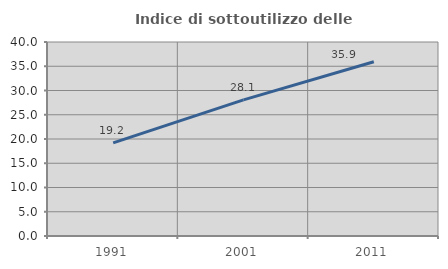
| Category | Indice di sottoutilizzo delle abitazioni  |
|---|---|
| 1991.0 | 19.19 |
| 2001.0 | 28.07 |
| 2011.0 | 35.919 |